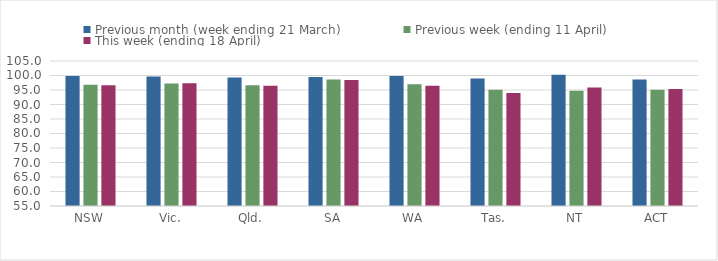
| Category | Previous month (week ending 21 March) | Previous week (ending 11 April) | This week (ending 18 April) |
|---|---|---|---|
| NSW | 99.798 | 96.83 | 96.656 |
| Vic. | 99.64 | 97.284 | 97.294 |
| Qld. | 99.293 | 96.633 | 96.468 |
| SA | 99.445 | 98.663 | 98.416 |
| WA | 99.805 | 96.974 | 96.45 |
| Tas. | 98.939 | 95.066 | 93.997 |
| NT | 100.242 | 94.719 | 95.875 |
| ACT | 98.592 | 95.126 | 95.312 |